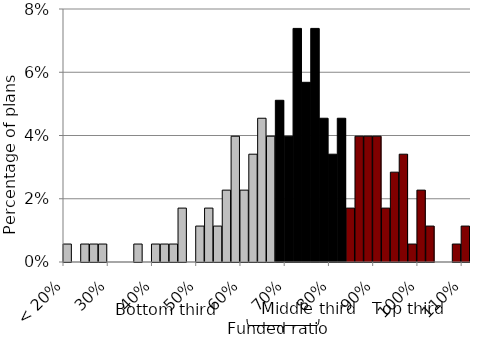
| Category | Series 0 |
|---|---|
| < 20% | 0.006 |
| 22% | 0 |
| 24% | 0.006 |
| 26% | 0.006 |
| 28% | 0.006 |
| 30% | 0 |
| 32% | 0 |
| 34% | 0 |
| 36% | 0.006 |
| 38% | 0 |
| 40% | 0.006 |
| 42% | 0.006 |
| 44% | 0.006 |
| 46% | 0.017 |
| 48% | 0 |
| 50% | 0.011 |
| 52% | 0.017 |
| 54% | 0.011 |
| 56% | 0.023 |
| 58% | 0.04 |
| 60% | 0.023 |
| 62% | 0.034 |
| 64% | 0.045 |
| 66% | 0.04 |
| 68% | 0.051 |
| 70% | 0.04 |
| 72% | 0.074 |
| 74% | 0.057 |
| 76% | 0.074 |
| 78% | 0.045 |
| 80% | 0.034 |
| 82% | 0.045 |
| 84% | 0.017 |
| 86% | 0.04 |
| 88% | 0.04 |
| 90% | 0.04 |
| 92% | 0.017 |
| 94% | 0.028 |
| 96% | 0.034 |
| 98% | 0.006 |
| 100% | 0.023 |
| 102% | 0.011 |
| 104% | 0 |
| 106% | 0 |
| 108% | 0.006 |
| 110% | 0.011 |